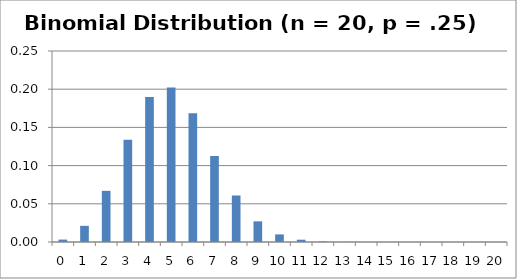
| Category | f(x) |
|---|---|
| 0.0 | 0.003 |
| 1.0 | 0.021 |
| 2.0 | 0.067 |
| 3.0 | 0.134 |
| 4.0 | 0.19 |
| 5.0 | 0.202 |
| 6.0 | 0.169 |
| 7.0 | 0.112 |
| 8.0 | 0.061 |
| 9.0 | 0.027 |
| 10.0 | 0.01 |
| 11.0 | 0.003 |
| 12.0 | 0.001 |
| 13.0 | 0 |
| 14.0 | 0 |
| 15.0 | 0 |
| 16.0 | 0 |
| 17.0 | 0 |
| 18.0 | 0 |
| 19.0 | 0 |
| 20.0 | 0 |